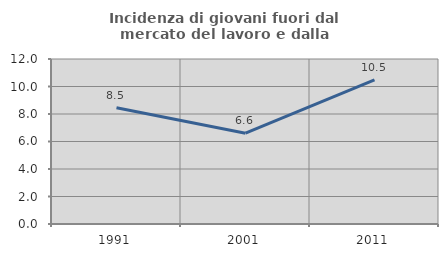
| Category | Incidenza di giovani fuori dal mercato del lavoro e dalla formazione  |
|---|---|
| 1991.0 | 8.456 |
| 2001.0 | 6.604 |
| 2011.0 | 10.475 |